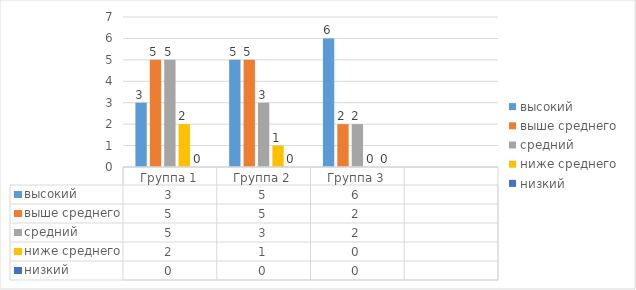
| Category | высокий | выше среднего | средний | ниже среднего | низкий |
|---|---|---|---|---|---|
| Группа 1 | 3 | 5 | 5 | 2 | 0 |
| Группа 2 | 5 | 5 | 3 | 1 | 0 |
| Группа 3 | 6 | 2 | 2 | 0 | 0 |